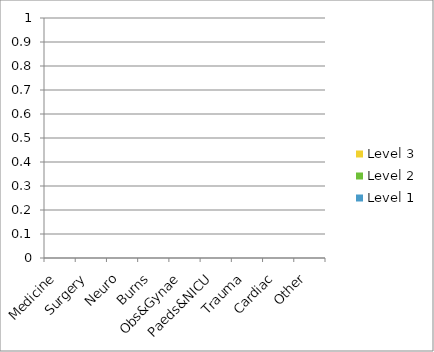
| Category | Level 1 | Level 2 | Level 3 |
|---|---|---|---|
| Medicine | 0 | 0 | 0 |
| Surgery | 0 | 0 | 0 |
| Neuro | 0 | 0 | 0 |
| Burns | 0 | 0 | 0 |
| Obs&Gynae | 0 | 0 | 0 |
| Paeds&NICU | 0 | 0 | 0 |
| Trauma | 0 | 0 | 0 |
| Cardiac | 0 | 0 | 0 |
| Other | 0 | 0 | 0 |